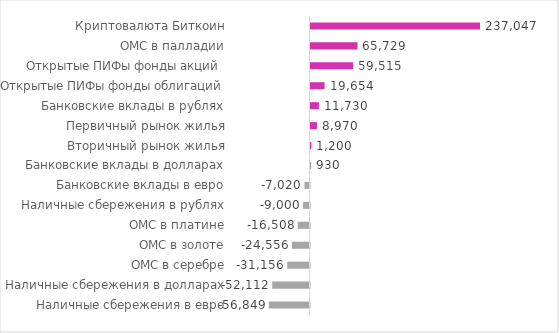
| Category | Реальная доходность, рублей |
|---|---|
| Криптовалюта Биткоин | 237047.134 |
| ОМС в палладии | 65728.886 |
| Открытые ПИФы фонды акций  | 59515.02 |
| Открытые ПИФы фонды облигаций | 19654.029 |
| Банковские вклады в рублях | 11730 |
| Первичный рынок жилья | 8970 |
| Вторичный рынок жилья | 1200 |
| Банковские вклады в долларах | 930 |
| Банковские вклады в евро | -7020 |
| Наличные сбережения в рублях | -9000 |
| ОМС в платине | -16507.821 |
| ОМС в золоте | -24555.556 |
| ОМС в серебре | -31156.334 |
| Наличные сбережения в долларах | -52111.74 |
| Наличные сбережения в евро | -56849.329 |